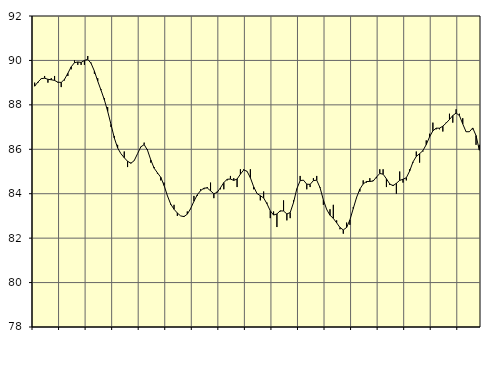
| Category | Piggar | Series 1 |
|---|---|---|
| nan | 89 | 88.84 |
| 87.0 | 89 | 89.03 |
| 87.0 | 89.2 | 89.18 |
| 87.0 | 89.3 | 89.2 |
| nan | 89 | 89.15 |
| 88.0 | 89.2 | 89.13 |
| 88.0 | 89.3 | 89.1 |
| 88.0 | 89 | 89.02 |
| nan | 88.8 | 89.01 |
| 89.0 | 89.1 | 89.15 |
| 89.0 | 89.3 | 89.42 |
| 89.0 | 89.6 | 89.71 |
| nan | 90 | 89.9 |
| 90.0 | 89.8 | 89.93 |
| 90.0 | 89.8 | 89.91 |
| 90.0 | 89.8 | 90 |
| nan | 90.2 | 90.05 |
| 91.0 | 89.9 | 89.87 |
| 91.0 | 89.4 | 89.52 |
| 91.0 | 89.2 | 89.07 |
| nan | 88.7 | 88.66 |
| 92.0 | 88.3 | 88.23 |
| 92.0 | 87.9 | 87.71 |
| 92.0 | 87 | 87.12 |
| nan | 86.6 | 86.51 |
| 93.0 | 86.2 | 86.06 |
| 93.0 | 85.8 | 85.8 |
| 93.0 | 85.9 | 85.62 |
| nan | 85.2 | 85.46 |
| 94.0 | 85.4 | 85.37 |
| 94.0 | 85.5 | 85.49 |
| 94.0 | 85.8 | 85.8 |
| nan | 86.1 | 86.11 |
| 95.0 | 86.3 | 86.21 |
| 95.0 | 86 | 85.96 |
| 95.0 | 85.4 | 85.52 |
| nan | 85.2 | 85.15 |
| 96.0 | 84.9 | 84.94 |
| 96.0 | 84.6 | 84.74 |
| 96.0 | 84.5 | 84.37 |
| nan | 83.9 | 83.91 |
| 97.0 | 83.5 | 83.53 |
| 97.0 | 83.5 | 83.3 |
| 97.0 | 83 | 83.13 |
| nan | 83 | 83 |
| 98.0 | 83 | 82.97 |
| 98.0 | 83.2 | 83.08 |
| 98.0 | 83.3 | 83.33 |
| nan | 83.9 | 83.66 |
| 99.0 | 83.9 | 83.95 |
| 99.0 | 84.2 | 84.14 |
| 99.0 | 84.2 | 84.25 |
| nan | 84.3 | 84.26 |
| 0.0 | 84.5 | 84.13 |
| 0.0 | 83.8 | 84 |
| 0.0 | 84.1 | 84.06 |
| nan | 84.2 | 84.27 |
| 1.0 | 84.2 | 84.5 |
| 1.0 | 84.6 | 84.65 |
| 1.0 | 84.8 | 84.66 |
| nan | 84.7 | 84.6 |
| 2.0 | 84.3 | 84.66 |
| 2.0 | 85.1 | 84.88 |
| 2.0 | 85.1 | 85.07 |
| nan | 85 | 85.01 |
| 3.0 | 85.1 | 84.72 |
| 3.0 | 84.2 | 84.31 |
| 3.0 | 84 | 84.01 |
| nan | 83.7 | 83.91 |
| 4.0 | 84.1 | 83.81 |
| 4.0 | 83.6 | 83.55 |
| 4.0 | 82.9 | 83.23 |
| nan | 83.2 | 83.04 |
| 5.0 | 82.5 | 83.09 |
| 5.0 | 83.2 | 83.23 |
| 5.0 | 83.7 | 83.22 |
| nan | 82.8 | 83.09 |
| 6.0 | 82.9 | 83.15 |
| 6.0 | 83.7 | 83.6 |
| 6.0 | 84.2 | 84.22 |
| nan | 84.8 | 84.59 |
| 7.0 | 84.6 | 84.61 |
| 7.0 | 84.2 | 84.43 |
| 7.0 | 84.3 | 84.42 |
| nan | 84.7 | 84.59 |
| 8.0 | 84.8 | 84.61 |
| 8.0 | 84.3 | 84.27 |
| 8.0 | 83.5 | 83.72 |
| nan | 83.3 | 83.29 |
| 9.0 | 83.3 | 83.03 |
| 9.0 | 83.5 | 82.89 |
| 9.0 | 82.8 | 82.69 |
| nan | 82.4 | 82.48 |
| 10.0 | 82.2 | 82.37 |
| 10.0 | 82.7 | 82.48 |
| 10.0 | 82.6 | 82.82 |
| nan | 83.4 | 83.33 |
| 11.0 | 83.8 | 83.83 |
| 11.0 | 84.1 | 84.21 |
| 11.0 | 84.6 | 84.44 |
| nan | 84.5 | 84.55 |
| 12.0 | 84.7 | 84.55 |
| 12.0 | 84.6 | 84.57 |
| 12.0 | 84.7 | 84.75 |
| nan | 85.1 | 84.91 |
| 13.0 | 85.1 | 84.88 |
| 13.0 | 84.3 | 84.67 |
| 13.0 | 84.4 | 84.44 |
| nan | 84.4 | 84.36 |
| 14.0 | 84 | 84.47 |
| 14.0 | 85 | 84.6 |
| 14.0 | 84.5 | 84.65 |
| nan | 84.6 | 84.72 |
| 15.0 | 85.1 | 85.02 |
| 15.0 | 85.4 | 85.43 |
| 15.0 | 85.9 | 85.68 |
| nan | 85.4 | 85.8 |
| 16.0 | 85.9 | 85.94 |
| 16.0 | 86.4 | 86.21 |
| 16.0 | 86.7 | 86.56 |
| nan | 87.2 | 86.83 |
| 17.0 | 86.9 | 86.95 |
| 17.0 | 86.9 | 86.95 |
| 17.0 | 86.8 | 87.04 |
| nan | 87.2 | 87.18 |
| 18.0 | 87.6 | 87.34 |
| 18.0 | 87.2 | 87.52 |
| 18.0 | 87.8 | 87.63 |
| nan | 87.6 | 87.52 |
| 19.0 | 87.4 | 87.14 |
| 19.0 | 86.8 | 86.79 |
| 19.0 | 86.8 | 86.79 |
| nan | 86.9 | 86.96 |
| 20.0 | 86.2 | 86.62 |
| 20.0 | 86.2 | 85.96 |